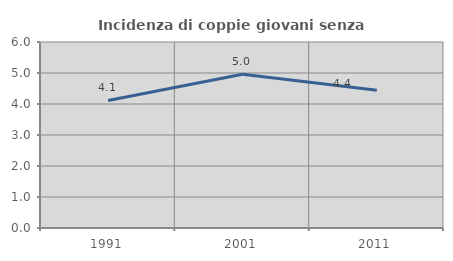
| Category | Incidenza di coppie giovani senza figli |
|---|---|
| 1991.0 | 4.113 |
| 2001.0 | 4.963 |
| 2011.0 | 4.442 |